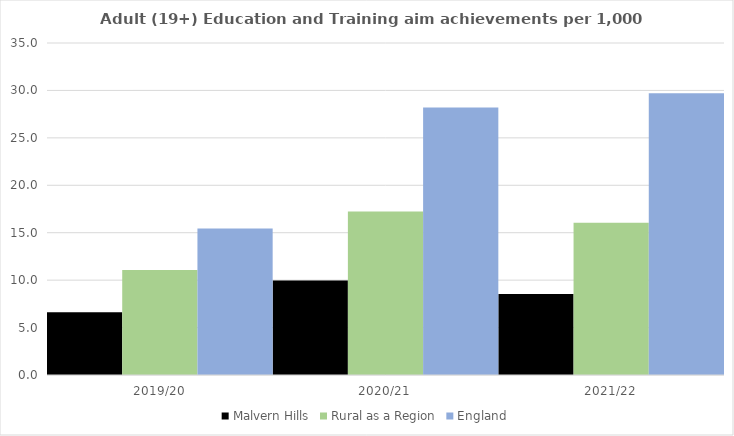
| Category | Malvern Hills | Rural as a Region | England |
|---|---|---|---|
| 2019/20 | 6.604 | 11.081 | 15.446 |
| 2020/21 | 9.967 | 17.224 | 28.211 |
| 2021/22 | 8.546 | 16.063 | 29.711 |